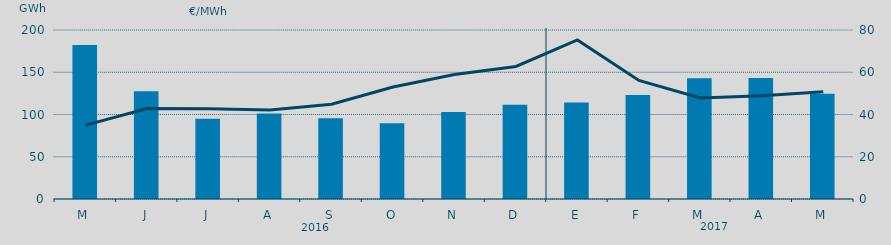
| Category | Energía a subir |
|---|---|
| M | 182305.28 |
| J | 127443.428 |
| J | 94842.941 |
| A | 101251.535 |
| S | 95450.948 |
| O | 89660.354 |
| N | 103079.487 |
| D | 111652.906 |
| E | 114098.605 |
| F | 123063.594 |
| M | 142874.975 |
| A | 143332.881 |
| M | 124663.514 |